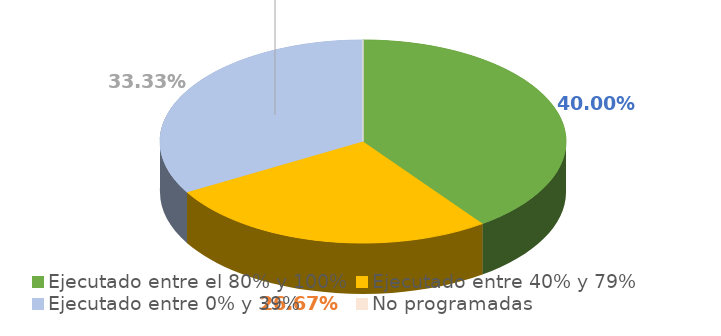
| Category | Series 0 |
|---|---|
| Ejecutado entre el 80% y 100% | 0.4 |
| Ejecutado entre 40% y 79% | 0.267 |
| Ejecutado entre 0% y 39% | 0.333 |
| No programadas | 0 |